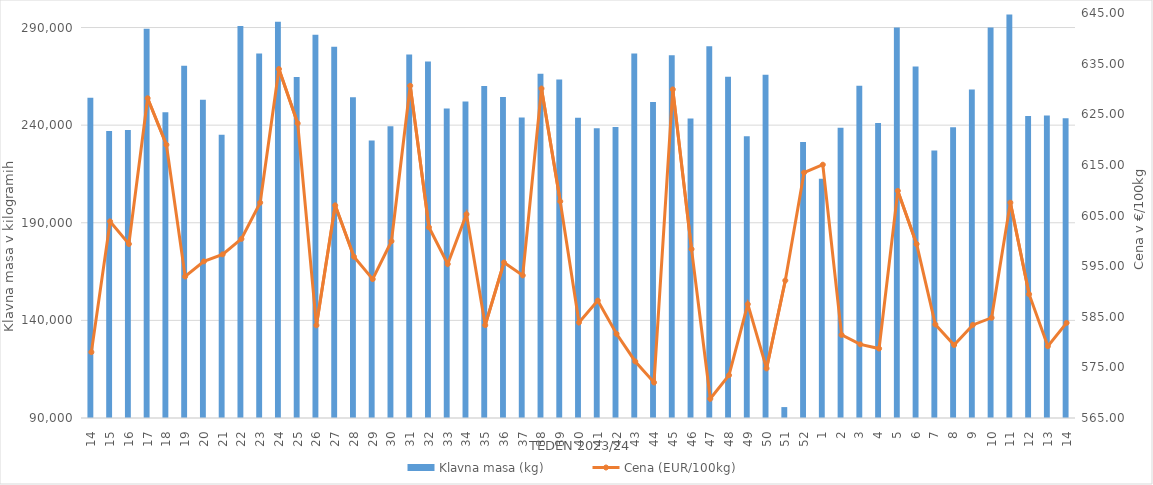
| Category | Klavna masa (kg) |
|---|---|
| 14.0 | 254072 |
| 15.0 | 236964 |
| 16.0 | 237552 |
| 17.0 | 289400 |
| 18.0 | 246616 |
| 19.0 | 270374 |
| 20.0 | 252984 |
| 21.0 | 235060 |
| 22.0 | 290816 |
| 23.0 | 276702 |
| 24.0 | 292976 |
| 25.0 | 264669 |
| 26.0 | 286237 |
| 27.0 | 280112 |
| 28.0 | 254336 |
| 29.0 | 232178 |
| 30.0 | 239437 |
| 31.0 | 276163 |
| 32.0 | 272647 |
| 33.0 | 248536 |
| 34.0 | 252050 |
| 35.0 | 260110 |
| 36.0 | 254389 |
| 37.0 | 243933 |
| 38.0 | 266321 |
| 39.0 | 263346 |
| 40.0 | 243765 |
| 41.0 | 238404 |
| 42.0 | 239007 |
| 43.0 | 276684 |
| 44.0 | 251832 |
| 45.0 | 275816 |
| 46.0 | 243425 |
| 47.0 | 280350 |
| 48.0 | 264849 |
| 49.0 | 234308 |
| 50.0 | 265786 |
| 51.0 | 95590 |
| 52.0 | 231370 |
| 1.0 | 212581 |
| 2.0 | 238607 |
| 3.0 | 260140 |
| 4.0 | 241148 |
| 5.0 | 290049 |
| 6.0 | 270025 |
| 7.0 | 227057 |
| 8.0 | 238927 |
| 9.0 | 258215 |
| 10.0 | 290025 |
| 11.0 | 296713 |
| 12.0 | 244673 |
| 13.0 | 244902 |
| 14.0 | 243567 |